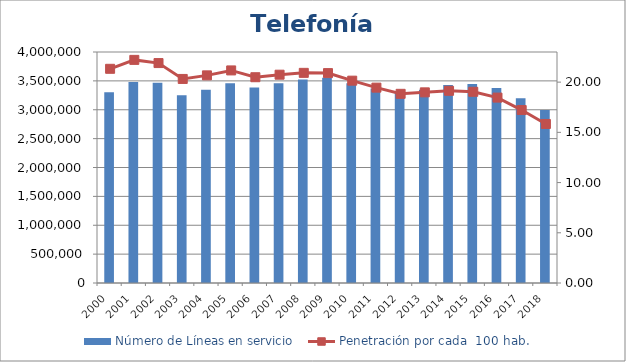
| Category | Número de Líneas en servicio |
|---|---|
| 2000.0 | 3302498 |
| 2001.0 | 3478492 |
| 2002.0 | 3467013 |
| 2003.0 | 3252063 |
| 2004.0 | 3345102 |
| 2005.0 | 3460645 |
| 2006.0 | 3383597 |
| 2007.0 | 3459611 |
| 2008.0 | 3524790 |
| 2009.0 | 3555311 |
| 2010.0 | 3459367 |
| 2011.0 | 3370104 |
| 2012.0 | 3292502 |
| 2013.0 | 3347231 |
| 2014.0 | 3427749 |
| 2015.0 | 3445880 |
| 2016.0 | 3375037 |
| 2017.0 | 3200245 |
| 2018.0 | 2997192 |